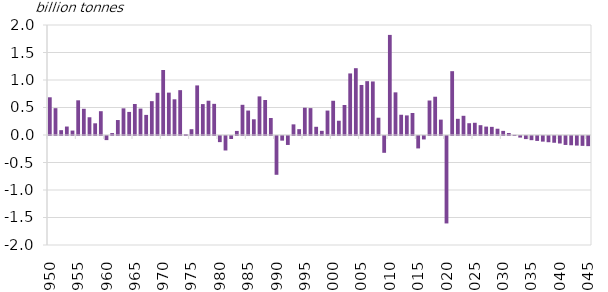
| Category | Change |
|---|---|
| 1950.0 | 0.686 |
| 1951.0 | 0.488 |
| 1952.0 | 0.088 |
| 1953.0 | 0.154 |
| 1954.0 | 0.081 |
| 1955.0 | 0.631 |
| 1956.0 | 0.477 |
| 1957.0 | 0.323 |
| 1958.0 | 0.213 |
| 1959.0 | 0.433 |
| 1960.0 | -0.075 |
| 1961.0 | 0.035 |
| 1962.0 | 0.272 |
| 1963.0 | 0.485 |
| 1964.0 | 0.42 |
| 1965.0 | 0.564 |
| 1966.0 | 0.48 |
| 1967.0 | 0.366 |
| 1968.0 | 0.616 |
| 1969.0 | 0.767 |
| 1970.0 | 1.182 |
| 1971.0 | 0.77 |
| 1972.0 | 0.649 |
| 1973.0 | 0.815 |
| 1974.0 | 0.016 |
| 1975.0 | 0.105 |
| 1976.0 | 0.902 |
| 1977.0 | 0.562 |
| 1978.0 | 0.623 |
| 1979.0 | 0.566 |
| 1980.0 | -0.111 |
| 1981.0 | -0.263 |
| 1982.0 | -0.054 |
| 1983.0 | 0.074 |
| 1984.0 | 0.549 |
| 1985.0 | 0.444 |
| 1986.0 | 0.286 |
| 1987.0 | 0.702 |
| 1988.0 | 0.636 |
| 1989.0 | 0.309 |
| 1990.0 | -0.705 |
| 1991.0 | -0.084 |
| 1992.0 | -0.163 |
| 1993.0 | 0.194 |
| 1994.0 | 0.106 |
| 1995.0 | 0.496 |
| 1996.0 | 0.489 |
| 1997.0 | 0.149 |
| 1998.0 | 0.076 |
| 1999.0 | 0.444 |
| 2000.0 | 0.622 |
| 2001.0 | 0.259 |
| 2002.0 | 0.546 |
| 2003.0 | 1.119 |
| 2004.0 | 1.215 |
| 2005.0 | 0.91 |
| 2006.0 | 0.979 |
| 2007.0 | 0.973 |
| 2008.0 | 0.314 |
| 2009.0 | -0.306 |
| 2010.0 | 1.82 |
| 2011.0 | 0.775 |
| 2012.0 | 0.368 |
| 2013.0 | 0.356 |
| 2014.0 | 0.4 |
| 2015.0 | -0.226 |
| 2016.0 | -0.063 |
| 2017.0 | 0.627 |
| 2018.0 | 0.696 |
| 2019.0 | 0.28 |
| 2020.0 | -1.59 |
| 2021.0 | 1.16 |
| 2022.0 | 0.294 |
| 2023.0 | 0.349 |
| 2024.0 | 0.214 |
| 2025.0 | 0.222 |
| 2026.0 | 0.179 |
| 2027.0 | 0.153 |
| 2028.0 | 0.148 |
| 2029.0 | 0.114 |
| 2030.0 | 0.075 |
| 2031.0 | 0.036 |
| 2032.0 | 0.003 |
| 2033.0 | -0.029 |
| 2034.0 | -0.056 |
| 2035.0 | -0.076 |
| 2036.0 | -0.089 |
| 2037.0 | -0.102 |
| 2038.0 | -0.113 |
| 2039.0 | -0.123 |
| 2040.0 | -0.136 |
| 2041.0 | -0.163 |
| 2042.0 | -0.168 |
| 2043.0 | -0.174 |
| 2044.0 | -0.18 |
| 2045.0 | -0.184 |